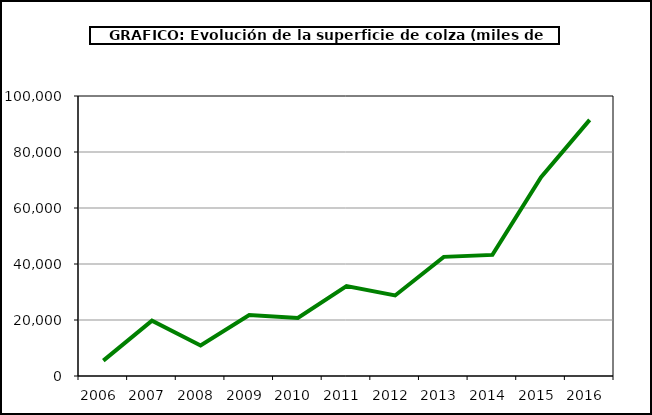
| Category | Superficie |
|---|---|
| 2006.0 | 5481 |
| 2007.0 | 19783 |
| 2008.0 | 10885 |
| 2009.0 | 21740 |
| 2010.0 | 20731 |
| 2011.0 | 32091 |
| 2012.0 | 28757 |
| 2013.0 | 42549 |
| 2014.0 | 43244 |
| 2015.0 | 71040 |
| 2016.0 | 91459 |